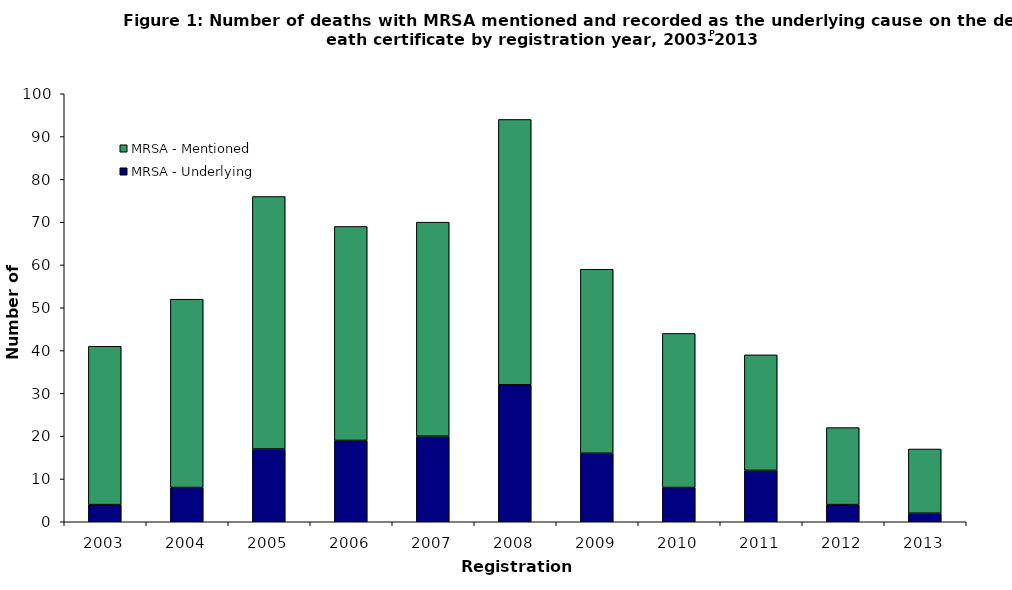
| Category | MRSA - Underlying | MRSA - Mentioned |
|---|---|---|
| 2003.0 | 4 | 37 |
| 2004.0 | 8 | 44 |
| 2005.0 | 17 | 59 |
| 2006.0 | 19 | 50 |
| 2007.0 | 20 | 50 |
| 2008.0 | 32 | 62 |
| 2009.0 | 16 | 43 |
| 2010.0 | 8 | 36 |
| 2011.0 | 12 | 27 |
| 2012.0 | 4 | 18 |
| 2013.0 | 2 | 15 |